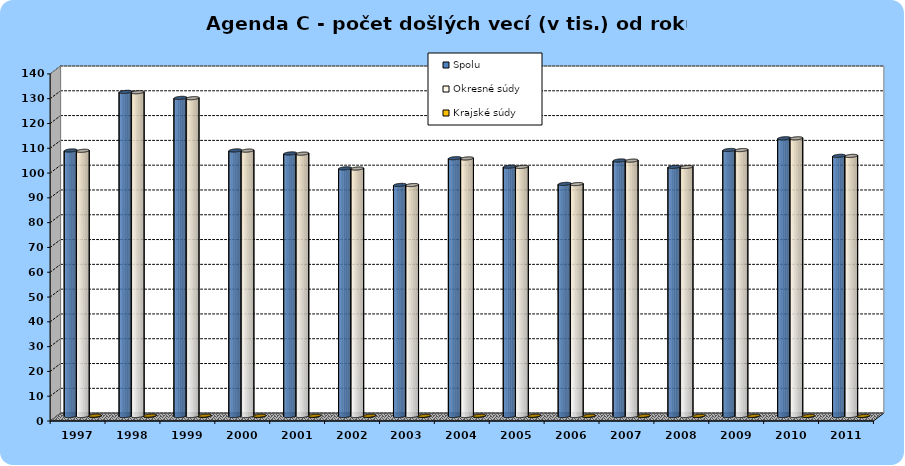
| Category | Spolu | Okresné súdy | Krajské súdy |
|---|---|---|---|
| 1997.0 | 107.1 | 106.97 | 0.13 |
| 1998.0 | 130.73 | 130.59 | 0.14 |
| 1999.0 | 128.31 | 128.19 | 0.12 |
| 2000.0 | 107.11 | 107.04 | 0.07 |
| 2001.0 | 105.9 | 105.82 | 0.08 |
| 2002.0 | 99.89 | 99.82 | 0.07 |
| 2003.0 | 93.2 | 93.15 | 0.05 |
| 2004.0 | 103.98 | 103.88 | 0.1 |
| 2005.0 | 100.56 | 100.47 | 0.09 |
| 2006.0 | 93.61 | 93.54 | 0.07 |
| 2007.0 | 103.06 | 103 | 0.06 |
| 2008.0 | 100.48 | 100.43 | 0.05 |
| 2009.0 | 107.3 | 107.26 | 0.04 |
| 2010.0 | 112.02 | 112 | 0.02 |
| 2011.0 | 104.93 | 104.91 | 0.02 |